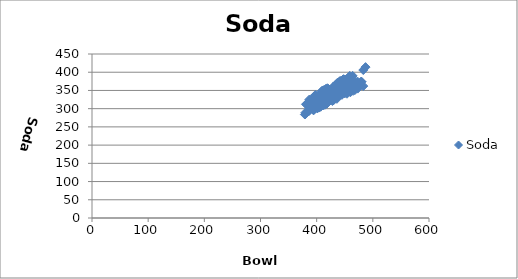
| Category | Soda |
|---|---|
| 391.0 | 313 |
| 418.0 | 326 |
| 459.0 | 358 |
| 424.0 | 331 |
| 447.0 | 380 |
| 383.0 | 291 |
| 399.0 | 307 |
| 440.0 | 361 |
| 436.0 | 344 |
| 413.0 | 351 |
| 428.0 | 338 |
| 479.0 | 374 |
| 462.0 | 388 |
| 387.0 | 325 |
| 454.0 | 341 |
| 418.0 | 314 |
| 447.0 | 375 |
| 442.0 | 376 |
| 381.0 | 312 |
| 401.0 | 301 |
| 468.0 | 370 |
| 428.0 | 321 |
| 480.0 | 374 |
| 436.0 | 327 |
| 474.0 | 370 |
| 487.0 | 414 |
| 459.0 | 386 |
| 421.0 | 354 |
| 401.0 | 313 |
| 420.0 | 319 |
| 435.0 | 365 |
| 458.0 | 357 |
| 379.0 | 284 |
| 426.0 | 337 |
| 443.0 | 368 |
| 483.0 | 406 |
| 409.0 | 348 |
| 406.0 | 325 |
| 454.0 | 359 |
| 468.0 | 351 |
| 421.0 | 345 |
| 404.0 | 311 |
| 387.0 | 298 |
| 412.0 | 309 |
| 400.0 | 324 |
| 418.0 | 351 |
| 441.0 | 375 |
| 409.0 | 335 |
| 443.0 | 346 |
| 425.0 | 340 |
| 445.0 | 369 |
| 467.0 | 369 |
| 473.0 | 364 |
| 437.0 | 350 |
| 445.0 | 338 |
| 380.0 | 289 |
| 415.0 | 311 |
| 430.0 | 327 |
| 433.0 | 338 |
| 395.0 | 332 |
| 423.0 | 334 |
| 463.0 | 384 |
| 436.0 | 331 |
| 394.0 | 296 |
| 412.0 | 350 |
| 416.0 | 354 |
| 419.0 | 356 |
| 429.0 | 326 |
| 409.0 | 319 |
| 415.0 | 336 |
| 437.0 | 336 |
| 417.0 | 317 |
| 441.0 | 353 |
| 421.0 | 320 |
| 436.0 | 331 |
| 447.0 | 362 |
| 416.0 | 312 |
| 415.0 | 336 |
| 447.0 | 371 |
| 459.0 | 367 |
| 425.0 | 332 |
| 432.0 | 328 |
| 437.0 | 354 |
| 423.0 | 338 |
| 459.0 | 349 |
| 473.0 | 355 |
| 437.0 | 341 |
| 413.0 | 326 |
| 441.0 | 353 |
| 414.0 | 323 |
| 455.0 | 382 |
| 423.0 | 343 |
| 419.0 | 335 |
| 408.0 | 339 |
| 398.0 | 338 |
| 421.0 | 349 |
| 451.0 | 379 |
| 424.0 | 331 |
| 410.0 | 328 |
| 450.0 | 342 |
| 415.0 | 349 |
| 460.0 | 363 |
| 464.0 | 390 |
| 439.0 | 364 |
| 437.0 | 371 |
| 459.0 | 390 |
| 433.0 | 364 |
| 432.0 | 337 |
| 431.0 | 353 |
| 417.0 | 329 |
| 380.0 | 285 |
| 423.0 | 343 |
| 431.0 | 332 |
| 451.0 | 379 |
| 474.0 | 360 |
| 413.0 | 330 |
| 431.0 | 332 |
| 387.0 | 298 |
| 404.0 | 303 |
| 424.0 | 326 |
| 391.0 | 305 |
| 446.0 | 348 |
| 422.0 | 333 |
| 415.0 | 315 |
| 422.0 | 346 |
| 460.0 | 345 |
| 444.0 | 373 |
| 434.0 | 356 |
| 430.0 | 344 |
| 411.0 | 316 |
| 436.0 | 340 |
| 432.0 | 328 |
| 430.0 | 323 |
| 425.0 | 327 |
| 400.0 | 316 |
| 448.0 | 358 |
| 394.0 | 299 |
| 434.0 | 352 |
| 448.0 | 376 |
| 392.0 | 321 |
| 407.0 | 305 |
| 453.0 | 371 |
| 462.0 | 351 |
| 410.0 | 332 |
| 468.0 | 365 |
| 427.0 | 342 |
| 445.0 | 369 |
| 382.0 | 313 |
| 434.0 | 360 |
| 426.0 | 341 |
| 448.0 | 381 |
| 403.0 | 334 |
| 413.0 | 322 |
| 420.0 | 353 |
| 404.0 | 311 |
| 483.0 | 362 |
| 454.0 | 363 |
| 432.0 | 346 |
| 386.0 | 293 |
| 402.0 | 302 |
| 468.0 | 360 |
| 400.0 | 320 |
| 419.0 | 335 |
| 408.0 | 314 |
| 452.0 | 366 |
| 410.0 | 349 |
| 395.0 | 332 |
| 430.0 | 344 |
| 388.0 | 318 |
| 393.0 | 307 |
| 473.0 | 374 |
| 465.0 | 349 |
| 395.0 | 296 |
| 431.0 | 328 |
| 452.0 | 348 |
| 397.0 | 310 |
| 446.0 | 375 |
| 408.0 | 326 |
| 430.0 | 361 |
| 414.0 | 323 |
| 418.0 | 314 |
| 447.0 | 380 |
| 404.0 | 327 |
| 408.0 | 310 |
| 457.0 | 356 |
| 421.0 | 324 |